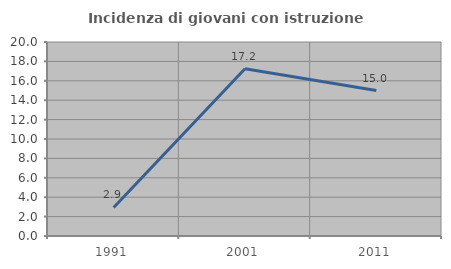
| Category | Incidenza di giovani con istruzione universitaria |
|---|---|
| 1991.0 | 2.941 |
| 2001.0 | 17.241 |
| 2011.0 | 15 |